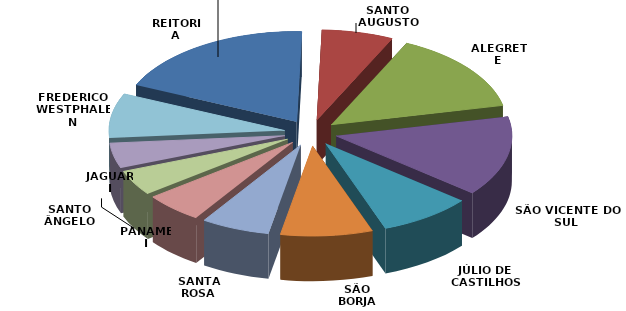
| Category | Series 0 | Series 1 |
|---|---|---|
| REITORIA | 8283809.83 | 0.188 |
| SANTO AUGUSTO | 2904686.65 | 0.066 |
| ALEGRETE | 6399611.34 | 0.145 |
| SÃO VICENTE DO SUL | 6319931.61 | 0.143 |
| JÚLIO DE CASTILHOS | 3783274.05 | 0.086 |
| SÃO BORJA | 3728993.14 | 0.085 |
| SANTA ROSA | 2783936.13 | 0.063 |
| PANAMBI | 2373599.65 | 0.054 |
| JAGUARI | 1998599.31 | 0.045 |
| SANTO ÂNGELO | 1985106.44 | 0.045 |
| FREDERICO WESTPHALEN | 3522004.92 | 0.08 |